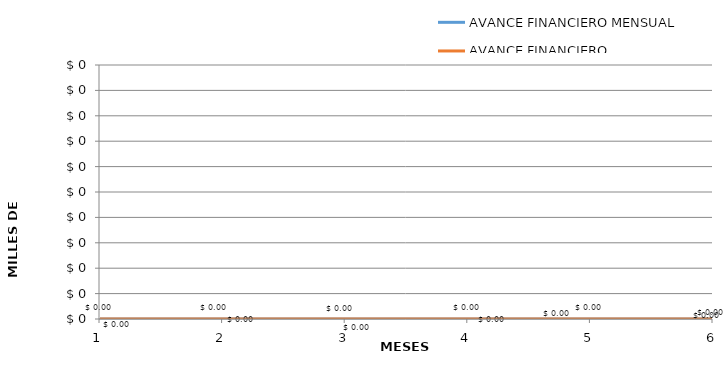
| Category | AVANCE FINANCIERO MENSUAL | AVANCE FINANCIERO ACUMULADO |
|---|---|---|
| 0 | 0 | 0 |
| 1 | 0 | 0 |
| 2 | 0 | 0 |
| 3 | 0 | 0 |
| 4 | 0 | 0 |
| 5 | 0 | 0 |